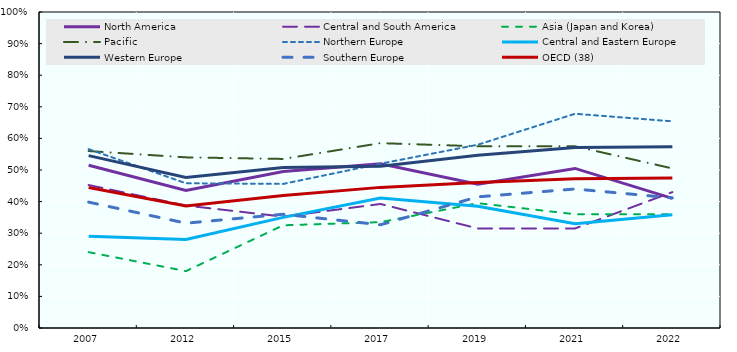
| Category | North America | Central and South America | Asia (Japan and Korea) | Pacific | Northern Europe | Central and Eastern Europe | Western Europe | Southern Europe | OECD (38) |
|---|---|---|---|---|---|---|---|---|---|
| 2007.0 | 51.5 | 45.25 | 24 | 56 | 56.6 | 29 | 54.556 | 39.833 | 44.447 |
| 2012.0 | 43.5 | 38.75 | 18 | 54 | 45.8 | 28 | 47.667 | 33.167 | 38.605 |
| 2015.0 | 49.5 | 35.25 | 32.5 | 53.5 | 45.6 | 35 | 50.778 | 36 | 41.921 |
| 2017.0 | 52 | 39.25 | 33.5 | 58.5 | 52 | 41.125 | 51.222 | 32.667 | 44.5 |
| 2019.0 | 45.5 | 31.5 | 39.5 | 57.5 | 58 | 38.5 | 54.667 | 41.5 | 46.053 |
| 2021.0 | 50.5 | 31.5 | 36 | 57.5 | 67.8 | 33 | 57.111 | 44 | 47.237 |
| 2022.0 | 41 | 43 | 36 | 50.5 | 65.4 | 35.875 | 57.333 | 41.167 | 47.47 |